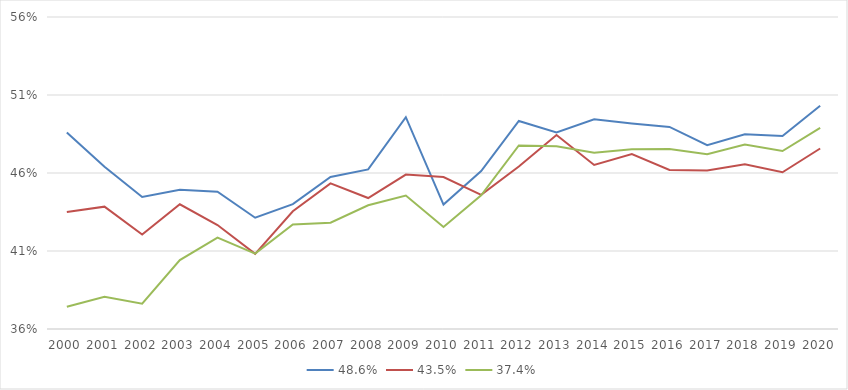
| Category | 48,6% | 43,5% | 37,4% |
|---|---|---|---|
| 2000 | 0.486 | 0.435 | 0.374 |
| 2001 | 0.464 | 0.438 | 0.381 |
| 2002 | 0.445 | 0.421 | 0.376 |
| 2003 | 0.449 | 0.44 | 0.404 |
| 2004 | 0.448 | 0.427 | 0.419 |
| 2005 | 0.431 | 0.408 | 0.408 |
| 2006 | 0.44 | 0.435 | 0.427 |
| 2007 | 0.457 | 0.453 | 0.428 |
| 2008 | 0.462 | 0.444 | 0.439 |
| 2009 | 0.496 | 0.459 | 0.446 |
| 2010 | 0.44 | 0.457 | 0.425 |
| 2011 | 0.461 | 0.446 | 0.446 |
| 2012 | 0.493 | 0.464 | 0.478 |
| 2013 | 0.486 | 0.484 | 0.477 |
| 2014 | 0.494 | 0.465 | 0.473 |
| 2015 | 0.492 | 0.472 | 0.475 |
| 2016 | 0.49 | 0.462 | 0.475 |
| 2017 | 0.478 | 0.462 | 0.472 |
| 2018 | 0.485 | 0.466 | 0.478 |
| 2019 | 0.484 | 0.46 | 0.474 |
| 2020 | 0.503 | 0.476 | 0.489 |